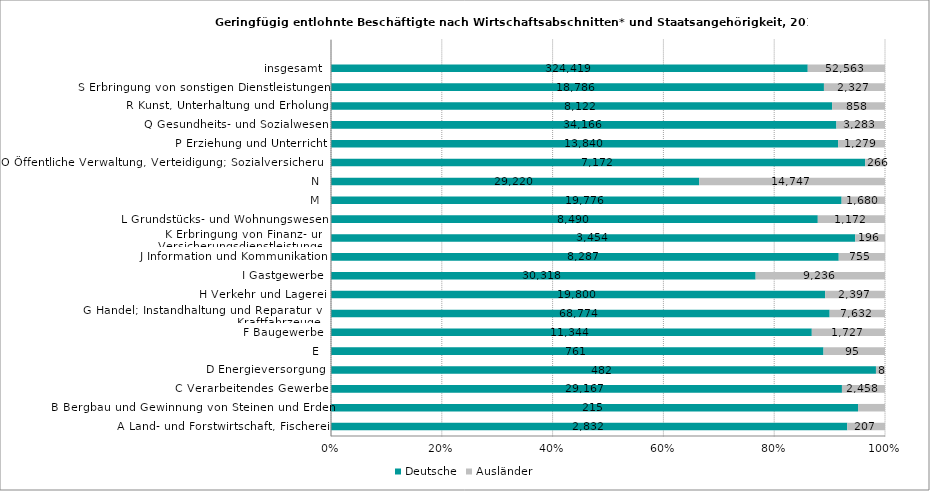
| Category | Deutsche | Ausländer |
|---|---|---|
| A Land- und Forstwirtschaft, Fischerei | 2832 | 207 |
| B Bergbau und Gewinnung von Steinen und Erden | 215 | 11 |
| C Verarbeitendes Gewerbe | 29167 | 2458 |
| D Energieversorgung | 482 | 8 |
| E | 761 | 95 |
| F Baugewerbe | 11344 | 1727 |
| G Handel; Instandhaltung und Reparatur von Kraftfahrzeugen | 68774 | 7632 |
| H Verkehr und Lagerei | 19800 | 2397 |
| I Gastgewerbe | 30318 | 9236 |
| J Information und Kommunikation | 8287 | 755 |
| K Erbringung von Finanz- und Versicherungsdienstleistungen | 3454 | 196 |
| L Grundstücks- und Wohnungswesen | 8490 | 1172 |
| M | 19776 | 1680 |
| N | 29220 | 14747 |
| O Öffentliche Verwaltung, Verteidigung; Sozialversicherung | 7172 | 266 |
| P Erziehung und Unterricht | 13840 | 1279 |
| Q Gesundheits- und Sozialwesen | 34166 | 3283 |
| R Kunst, Unterhaltung und Erholung | 8122 | 858 |
| S Erbringung von sonstigen Dienstleistungen | 18786 | 2327 |
| insgesamt | 324419 | 52563 |